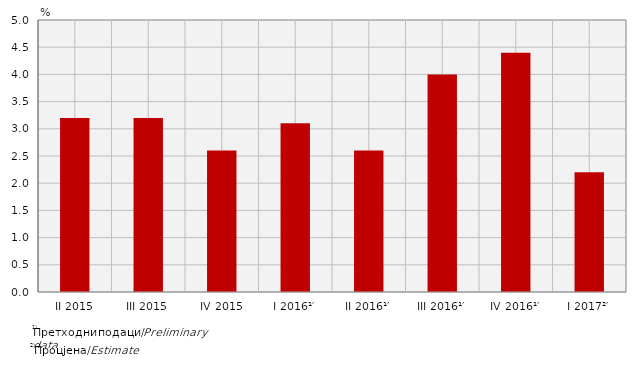
| Category | Стопе реалног раста БДП-а
Real growth rates of GDP |
|---|---|
| II 2015 | 3.2 |
| III 2015 | 3.2 |
| IV 2015 | 2.6 |
| I 2016¹′ | 3.1 |
| II 2016¹′ | 2.6 |
| III 2016¹′ | 4 |
| IV 2016¹′ | 4.4 |
| I 2017²′ | 2.2 |